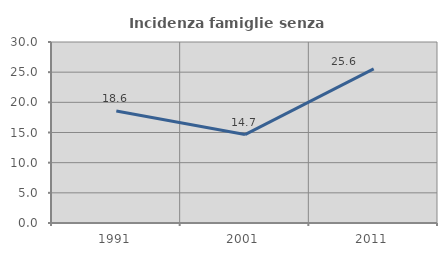
| Category | Incidenza famiglie senza nuclei |
|---|---|
| 1991.0 | 18.56 |
| 2001.0 | 14.659 |
| 2011.0 | 25.552 |